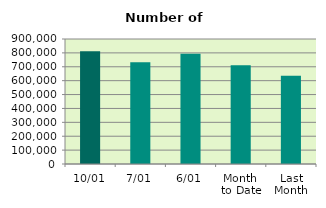
| Category | Series 0 |
|---|---|
| 10/01 | 812064 |
| 7/01 | 732734 |
| 6/01 | 793604 |
| Month 
to Date | 710800.333 |
| Last
Month | 635205.478 |